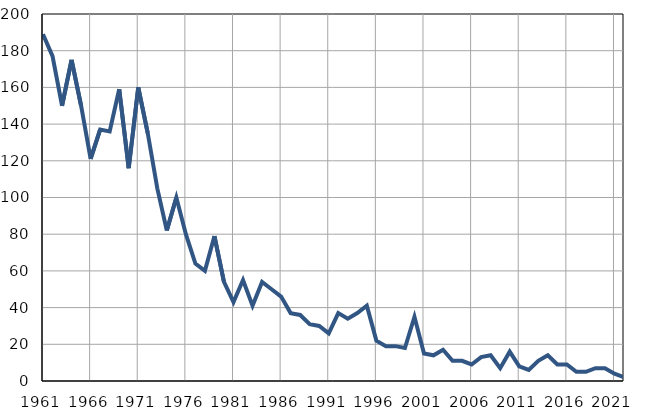
| Category | Infants
deaths |
|---|---|
| 1961.0 | 189 |
| 1962.0 | 177 |
| 1963.0 | 150 |
| 1964.0 | 175 |
| 1965.0 | 150 |
| 1966.0 | 121 |
| 1967.0 | 137 |
| 1968.0 | 136 |
| 1969.0 | 159 |
| 1970.0 | 116 |
| 1971.0 | 160 |
| 1972.0 | 135 |
| 1973.0 | 105 |
| 1974.0 | 82 |
| 1975.0 | 100 |
| 1976.0 | 80 |
| 1977.0 | 64 |
| 1978.0 | 60 |
| 1979.0 | 79 |
| 1980.0 | 54 |
| 1981.0 | 43 |
| 1982.0 | 55 |
| 1983.0 | 41 |
| 1984.0 | 54 |
| 1985.0 | 50 |
| 1986.0 | 46 |
| 1987.0 | 37 |
| 1988.0 | 36 |
| 1989.0 | 31 |
| 1990.0 | 30 |
| 1991.0 | 26 |
| 1992.0 | 37 |
| 1993.0 | 34 |
| 1994.0 | 37 |
| 1995.0 | 41 |
| 1996.0 | 22 |
| 1997.0 | 19 |
| 1998.0 | 19 |
| 1999.0 | 18 |
| 2000.0 | 35 |
| 2001.0 | 15 |
| 2002.0 | 14 |
| 2003.0 | 17 |
| 2004.0 | 11 |
| 2005.0 | 11 |
| 2006.0 | 9 |
| 2007.0 | 13 |
| 2008.0 | 14 |
| 2009.0 | 7 |
| 2010.0 | 16 |
| 2011.0 | 8 |
| 2012.0 | 6 |
| 2013.0 | 11 |
| 2014.0 | 14 |
| 2015.0 | 9 |
| 2016.0 | 9 |
| 2017.0 | 5 |
| 2018.0 | 5 |
| 2019.0 | 7 |
| 2020.0 | 7 |
| 2021.0 | 4 |
| 2022.0 | 2 |